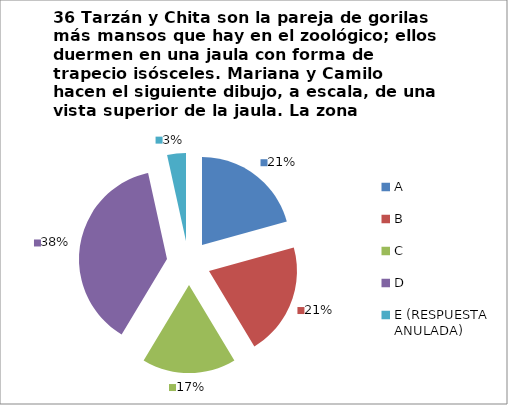
| Category | CANTIDAD DE RESPUESTAS PREGUNTA (36) | PORCENTAJE |
|---|---|---|
| A | 6 | 0.207 |
| B | 6 | 0.207 |
| C | 5 | 0.172 |
| D | 11 | 0.379 |
| E (RESPUESTA ANULADA) | 1 | 0.034 |